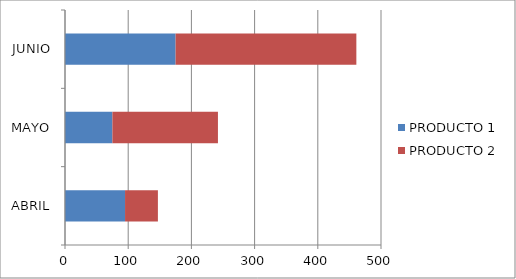
| Category | PRODUCTO 1 | PRODUCTO 2 |
|---|---|---|
| ABRIL | 95 | 52 |
| MAYO | 75 | 167 |
| JUNIO | 175 | 286 |